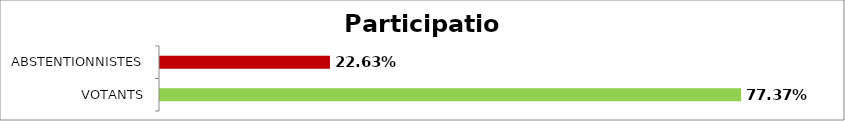
| Category | Participation |
|---|---|
| VOTANTS | 0.774 |
| ABSTENTIONNISTES | 0.226 |